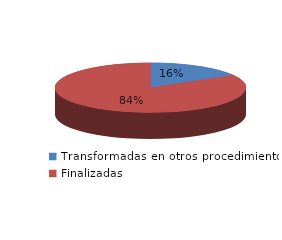
| Category | Series 0 |
|---|---|
| Transformadas en otros procedimientos | 1151 |
| Finalizadas | 5838 |